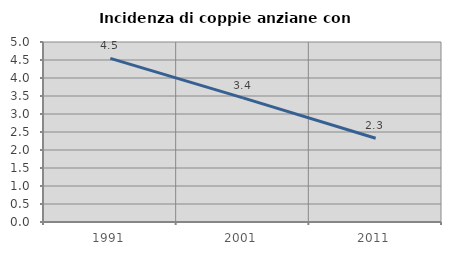
| Category | Incidenza di coppie anziane con figli |
|---|---|
| 1991.0 | 4.545 |
| 2001.0 | 3.448 |
| 2011.0 | 2.326 |